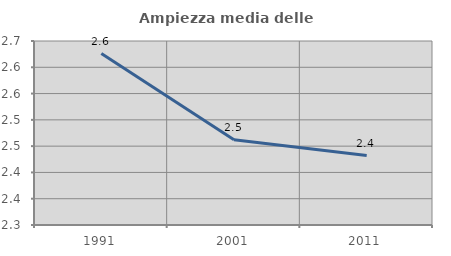
| Category | Ampiezza media delle famiglie |
|---|---|
| 1991.0 | 2.626 |
| 2001.0 | 2.462 |
| 2011.0 | 2.432 |